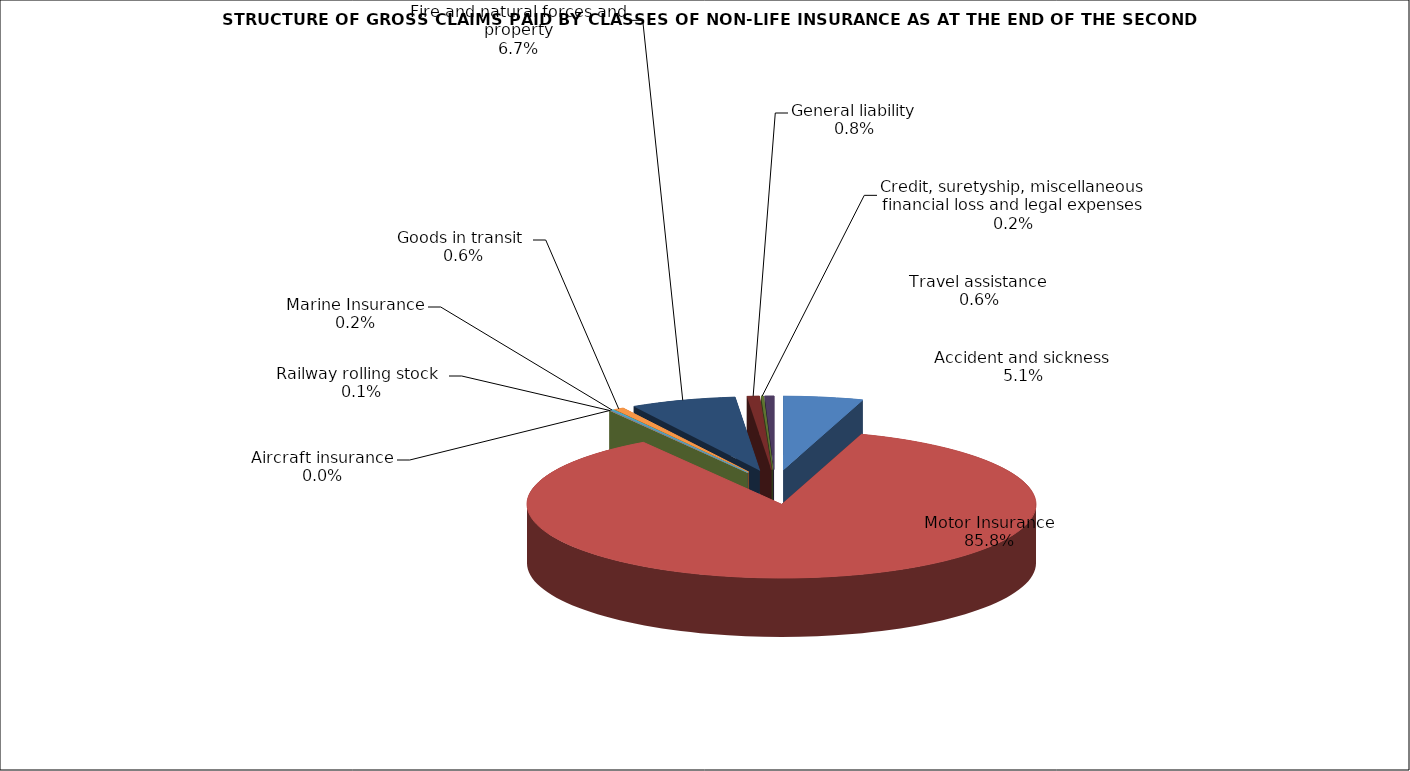
| Category | Accident and sickness |
|---|---|
| Accident and sickness | 0.051 |
| Motor Insurance | 0.858 |
| Railway rolling stock  | 0.001 |
| Aircraft insurance | 0 |
| Marine Insurance | 0.002 |
| Goods in transit  | 0.006 |
| Fire and natural forces and property | 0.067 |
| General liability | 0.008 |
| Credit, suretyship, miscellaneous financial loss and legal expenses | 0.002 |
| Travel assistance | 0.006 |